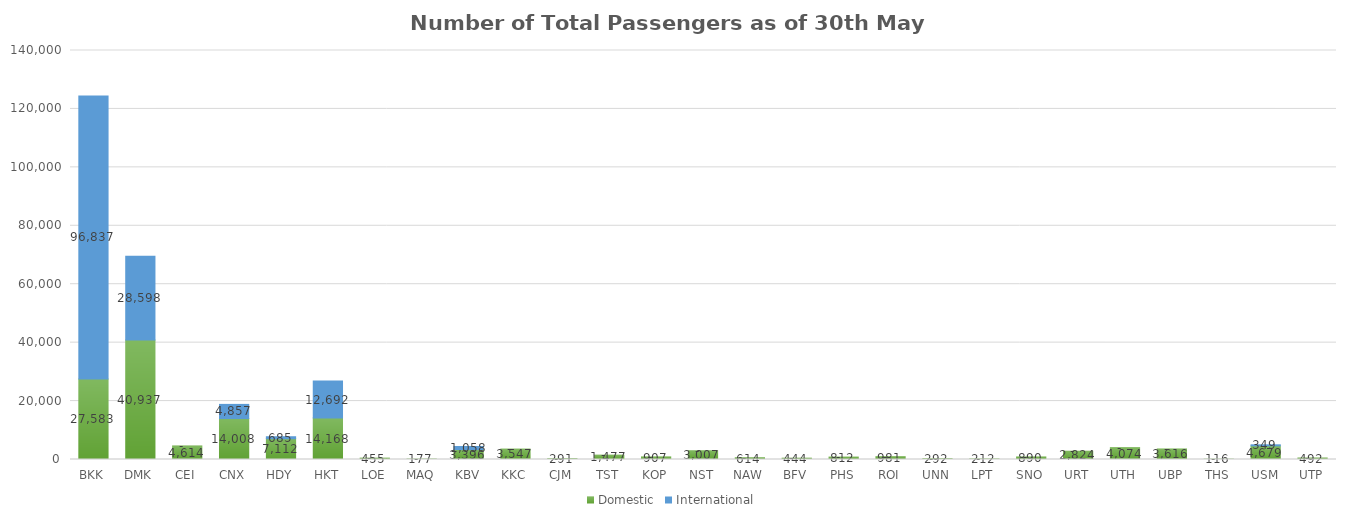
| Category | Domestic | International |
|---|---|---|
| BKK | 27583 | 96837 |
| DMK | 40937 | 28598 |
| CEI | 4614 | 0 |
| CNX | 14008 | 4857 |
| HDY | 7112 | 685 |
| HKT | 14168 | 12692 |
| LOE | 455 | 0 |
| MAQ | 177 | 0 |
| KBV | 3396 | 1058 |
| KKC | 3547 | 0 |
| CJM | 291 | 0 |
| TST | 1477 | 0 |
| KOP | 907 | 0 |
| NST | 3007 | 0 |
| NAW | 614 | 0 |
| BFV | 444 | 0 |
| PHS | 812 | 0 |
| ROI | 981 | 0 |
| UNN | 292 | 0 |
| LPT | 212 | 0 |
| SNO | 890 | 0 |
| URT | 2824 | 0 |
| UTH | 4074 | 0 |
| UBP | 3616 | 0 |
| THS | 116 | 0 |
| USM | 4679 | 349 |
| UTP | 492 | 0 |